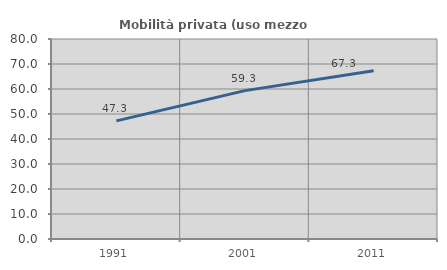
| Category | Mobilità privata (uso mezzo privato) |
|---|---|
| 1991.0 | 47.256 |
| 2001.0 | 59.347 |
| 2011.0 | 67.267 |